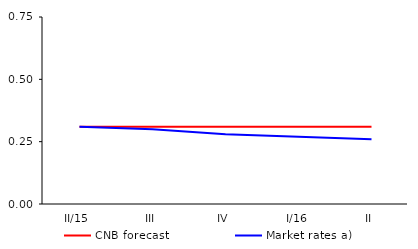
| Category | CNB forecast | Market rates a) |
|---|---|---|
| II/15 | 0.31 | 0.31 |
| III | 0.31 | 0.3 |
| IV | 0.31 | 0.28 |
| I/16 | 0.31 | 0.27 |
| II | 0.31 | 0.26 |